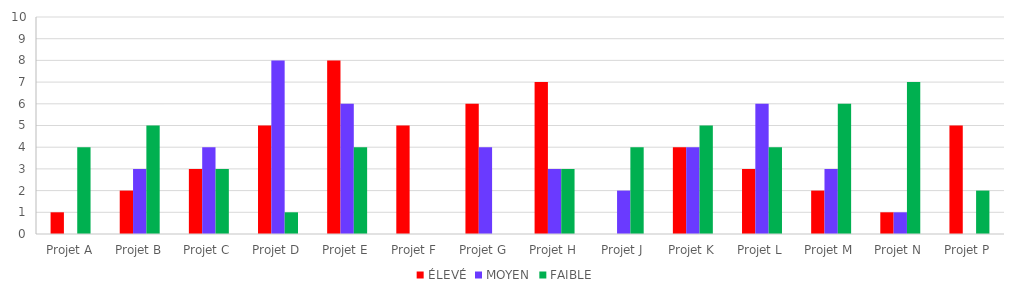
| Category | ÉLEVÉ | MOYEN | FAIBLE |
|---|---|---|---|
| Projet A | 1 | 0 | 4 |
| Projet B | 2 | 3 | 5 |
| Projet C | 3 | 4 | 3 |
| Projet D | 5 | 8 | 1 |
| Projet E | 8 | 6 | 4 |
| Projet F | 5 | 0 | 0 |
| Projet G | 6 | 4 | 0 |
| Projet H | 7 | 3 | 3 |
| Projet J | 0 | 2 | 4 |
| Projet K | 4 | 4 | 5 |
| Projet L | 3 | 6 | 4 |
| Projet M | 2 | 3 | 6 |
| Projet N | 1 | 1 | 7 |
| Projet P | 5 | 0 | 2 |